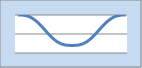
| Category | Series 1 |
|---|---|
| 0.0 | 0 |
| 0.0006 | -0.005 |
| 0.0012 | -0.041 |
| 0.0018 | -0.13 |
| 0.0024 | -0.282 |
| 0.0029999999999999996 | -0.49 |
| 0.0035999999999999995 | -0.736 |
| 0.0042 | -0.99 |
| 0.0048 | -1.22 |
| 0.005399999999999999 | -1.402 |
| 0.005999999999999999 | -1.522 |
| 0.006599999999999999 | -1.582 |
| 0.007199999999999999 | -1.599 |
| 0.007799999999999999 | -1.599 |
| 0.0084 | -1.582 |
| 0.009 | -1.522 |
| 0.0096 | -1.402 |
| 0.010199999999999999 | -1.22 |
| 0.010799999999999999 | -0.99 |
| 0.011399999999999999 | -0.736 |
| 0.011999999999999999 | -0.49 |
| 0.012599999999999998 | -0.282 |
| 0.013199999999999998 | -0.13 |
| 0.013799999999999998 | -0.041 |
| 0.014399999999999998 | -0.005 |
| 0.014999999999999998 | 0 |